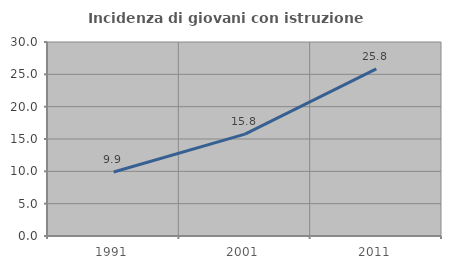
| Category | Incidenza di giovani con istruzione universitaria |
|---|---|
| 1991.0 | 9.896 |
| 2001.0 | 15.758 |
| 2011.0 | 25.833 |